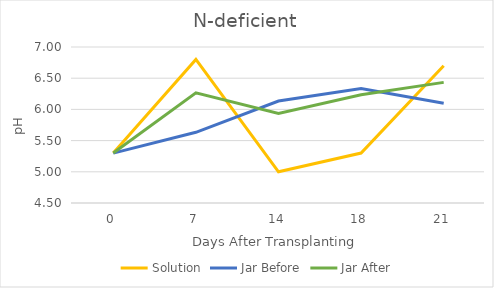
| Category | Solution | Jar Before | Jar After |
|---|---|---|---|
| 0.0 | 5.3 | 5.3 | 5.3 |
| 7.0 | 6.8 | 5.633 | 6.267 |
| 14.0 | 5 | 6.133 | 5.933 |
| 18.0 | 5.3 | 6.333 | 6.233 |
| 21.0 | 6.7 | 6.1 | 6.433 |